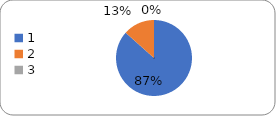
| Category | Series 0 |
|---|---|
| 0 | 84 |
| 1 | 13 |
| 2 | 0 |